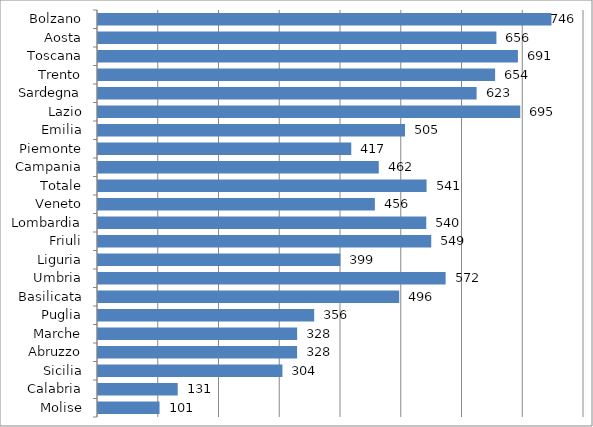
| Category | Series 0 |
|---|---|
| Bolzano | 746.393 |
| Aosta | 655.82 |
| Toscana | 691.24 |
| Trento | 653.679 |
| Sardegna | 623.229 |
| Lazio | 695.077 |
| Emilia | 505.399 |
| Piemonte | 416.887 |
| Campania | 462.202 |
| Totale | 540.874 |
| Veneto | 455.77 |
| Lombardia | 540.382 |
| Friuli | 548.558 |
| Liguria | 398.939 |
| Umbria | 572.228 |
| Basilicata | 495.839 |
| Puglia | 355.853 |
| Marche | 327.759 |
| Abruzzo | 327.704 |
| Sicilia | 303.57 |
| Calabria | 131.235 |
| Molise | 101.298 |